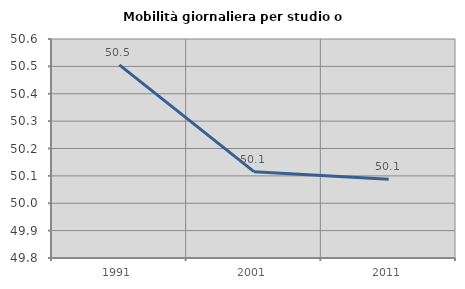
| Category | Mobilità giornaliera per studio o lavoro |
|---|---|
| 1991.0 | 50.506 |
| 2001.0 | 50.115 |
| 2011.0 | 50.088 |